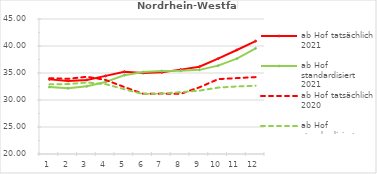
| Category | ab Hof tatsächlich 2021 | ab Hof standardisiert 2021 | ab Hof tatsächlich 2020 | ab Hof standardisiert 2020 |
|---|---|---|---|---|
| 0 | 33.82 | 32.404 | 34.036 | 32.893 |
| 1 | 33.529 | 32.169 | 33.926 | 32.948 |
| 2 | 33.717 | 32.552 | 34.303 | 33.25 |
| 3 | 34.464 | 33.342 | 33.72 | 32.937 |
| 4 | 35.237 | 34.603 | 32.4 | 31.994 |
| 5 | 35.008 | 35.186 | 31.145 | 31.086 |
| 6 | 35.119 | 35.378 | 31.184 | 31.205 |
| 7 | 35.627 | 35.422 | 31.148 | 31.453 |
| 8 | 36.168 | 35.579 | 32.343 | 31.74 |
| 9 | 37.669 | 36.36 | 33.858 | 32.295 |
| 10 | 39.264 | 37.655 | 34.056 | 32.505 |
| 11 | 40.909 | 39.567 | 34.239 | 32.65 |